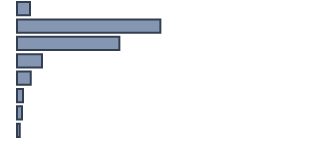
| Category | Percentatge |
|---|---|
| 0 | 4.4 |
| 1 | 48.6 |
| 2 | 34.7 |
| 3 | 8.5 |
| 4 | 4.7 |
| 5 | 2 |
| 6 | 1.7 |
| 7 | 0.9 |